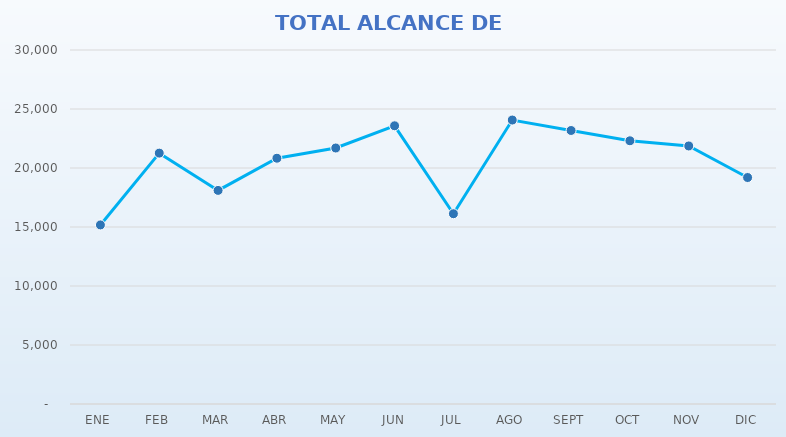
| Category | Series 0 | Series 1 |
|---|---|---|
| ENE |  | 15175 |
| FEB |  | 21262 |
| MAR |  | 18101 |
| ABR |  | 20828 |
| MAY |  | 21694 |
| JUN |  | 23577 |
| JUL |  | 16125 |
| AGO |  | 24065 |
| SEPT |  | 23179 |
| OCT |  | 22307 |
| NOV |  | 21867 |
| DIC |  | 19193 |